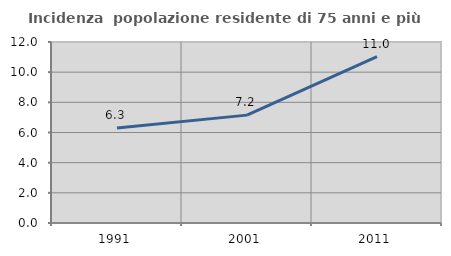
| Category | Incidenza  popolazione residente di 75 anni e più |
|---|---|
| 1991.0 | 6.292 |
| 2001.0 | 7.152 |
| 2011.0 | 11.023 |